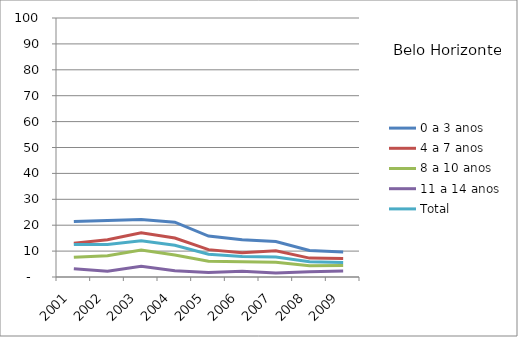
| Category | 0 a 3 anos | 4 a 7 anos | 8 a 10 anos | 11 a 14 anos | Total |
|---|---|---|---|---|---|
| 2001.0 | 21.47 | 13.06 | 7.58 | 3.17 | 12.55 |
| 2002.0 | 21.81 | 14.42 | 8.24 | 2.21 | 12.56 |
| 2003.0 | 22.18 | 17.06 | 10.38 | 4.14 | 14.01 |
| 2004.0 | 21.15 | 15.05 | 8.47 | 2.43 | 12.24 |
| 2005.0 | 15.79 | 10.57 | 6.12 | 1.75 | 8.8 |
| 2006.0 | 14.41 | 9.35 | 5.89 | 2.19 | 7.96 |
| 2007.0 | 13.68 | 10.15 | 5.72 | 1.5 | 7.76 |
| 2008.0 | 10.22 | 7.3 | 4.38 | 2.04 | 5.9 |
| 2009.0 | 9.7 | 7.12 | 4.4 | 2.27 | 5.56 |